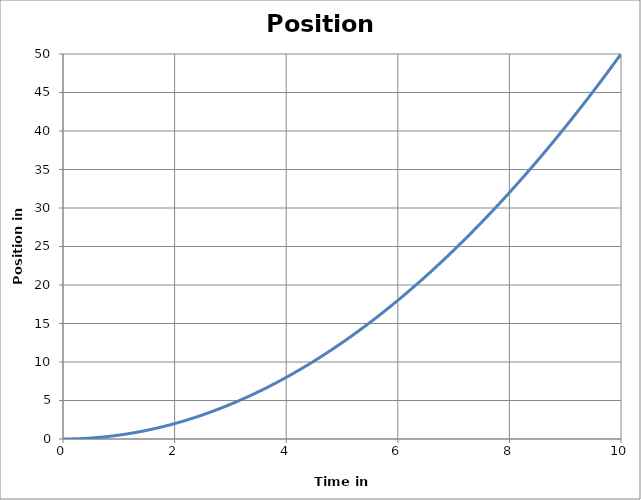
| Category | Position (m) |
|---|---|
| 0.0 | 0 |
| 0.1 | 0.005 |
| 0.2 | 0.02 |
| 0.30000000000000004 | 0.045 |
| 0.4 | 0.08 |
| 0.5 | 0.125 |
| 0.6 | 0.18 |
| 0.7 | 0.245 |
| 0.7999999999999999 | 0.32 |
| 0.8999999999999999 | 0.405 |
| 0.9999999999999999 | 0.5 |
| 1.0999999999999999 | 0.605 |
| 1.2 | 0.72 |
| 1.3 | 0.845 |
| 1.4000000000000001 | 0.98 |
| 1.5000000000000002 | 1.125 |
| 1.6000000000000003 | 1.28 |
| 1.7000000000000004 | 1.445 |
| 1.8000000000000005 | 1.62 |
| 1.9000000000000006 | 1.805 |
| 2.0000000000000004 | 2 |
| 2.1000000000000005 | 2.205 |
| 2.2000000000000006 | 2.42 |
| 2.3000000000000007 | 2.645 |
| 2.400000000000001 | 2.88 |
| 2.500000000000001 | 3.125 |
| 2.600000000000001 | 3.38 |
| 2.700000000000001 | 3.645 |
| 2.800000000000001 | 3.92 |
| 2.9000000000000012 | 4.205 |
| 3.0000000000000013 | 4.5 |
| 3.1000000000000014 | 4.805 |
| 3.2000000000000015 | 5.12 |
| 3.3000000000000016 | 5.445 |
| 3.4000000000000017 | 5.78 |
| 3.5000000000000018 | 6.125 |
| 3.600000000000002 | 6.48 |
| 3.700000000000002 | 6.845 |
| 3.800000000000002 | 7.22 |
| 3.900000000000002 | 7.605 |
| 4.000000000000002 | 8 |
| 4.100000000000001 | 8.405 |
| 4.200000000000001 | 8.82 |
| 4.300000000000001 | 9.245 |
| 4.4 | 9.68 |
| 4.5 | 10.125 |
| 4.6 | 10.58 |
| 4.699999999999999 | 11.045 |
| 4.799999999999999 | 11.52 |
| 4.899999999999999 | 12.005 |
| 4.999999999999998 | 12.5 |
| 5.099999999999998 | 13.005 |
| 5.1999999999999975 | 13.52 |
| 5.299999999999997 | 14.045 |
| 5.399999999999997 | 14.58 |
| 5.4999999999999964 | 15.125 |
| 5.599999999999996 | 15.68 |
| 5.699999999999996 | 16.245 |
| 5.799999999999995 | 16.82 |
| 5.899999999999995 | 17.405 |
| 5.999999999999995 | 18 |
| 6.099999999999994 | 18.605 |
| 6.199999999999994 | 19.22 |
| 6.299999999999994 | 19.845 |
| 6.399999999999993 | 20.48 |
| 6.499999999999993 | 21.125 |
| 6.5999999999999925 | 21.78 |
| 6.699999999999992 | 22.445 |
| 6.799999999999992 | 23.12 |
| 6.8999999999999915 | 23.805 |
| 6.999999999999991 | 24.5 |
| 7.099999999999991 | 25.205 |
| 7.19999999999999 | 25.92 |
| 7.29999999999999 | 26.645 |
| 7.39999999999999 | 27.38 |
| 7.499999999999989 | 28.125 |
| 7.599999999999989 | 28.88 |
| 7.699999999999989 | 29.645 |
| 7.799999999999988 | 30.42 |
| 7.899999999999988 | 31.205 |
| 7.999999999999988 | 32 |
| 8.099999999999987 | 32.805 |
| 8.199999999999987 | 33.62 |
| 8.299999999999986 | 34.445 |
| 8.399999999999986 | 35.28 |
| 8.499999999999986 | 36.125 |
| 8.599999999999985 | 36.98 |
| 8.699999999999985 | 37.845 |
| 8.799999999999985 | 38.72 |
| 8.899999999999984 | 39.605 |
| 8.999999999999984 | 40.5 |
| 9.099999999999984 | 41.405 |
| 9.199999999999983 | 42.32 |
| 9.299999999999983 | 43.245 |
| 9.399999999999983 | 44.18 |
| 9.499999999999982 | 45.125 |
| 9.599999999999982 | 46.08 |
| 9.699999999999982 | 47.045 |
| 9.799999999999981 | 48.02 |
| 9.89999999999998 | 49.005 |
| 9.99999999999998 | 50 |